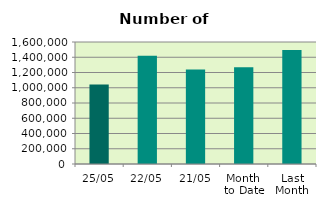
| Category | Series 0 |
|---|---|
| 25/05 | 1041888 |
| 22/05 | 1420532 |
| 21/05 | 1238022 |
| Month 
to Date | 1267777 |
| Last
Month | 1493476.8 |